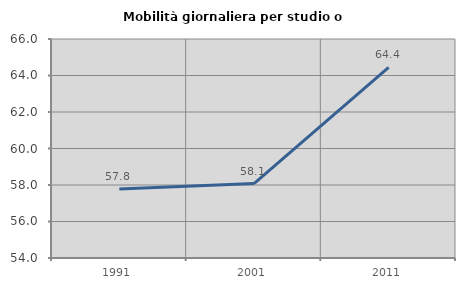
| Category | Mobilità giornaliera per studio o lavoro |
|---|---|
| 1991.0 | 57.775 |
| 2001.0 | 58.081 |
| 2011.0 | 64.443 |